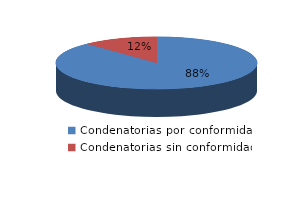
| Category | Series 0 |
|---|---|
| 0 | 1748 |
| 1 | 240 |